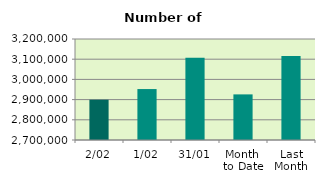
| Category | Series 0 |
|---|---|
| 2/02 | 2899426 |
| 1/02 | 2952204 |
| 31/01 | 3106684 |
| Month 
to Date | 2925815 |
| Last
Month | 3115708.381 |